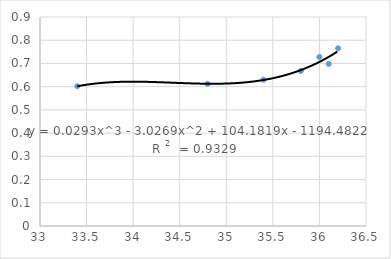
| Category | Series 0 |
|---|---|
| 33.4 | 0.602 |
| 34.8 | 0.612 |
| 35.4 | 0.63 |
| 35.8 | 0.668 |
| 36.1 | 0.698 |
| 36.0 | 0.728 |
| 36.2 | 0.765 |